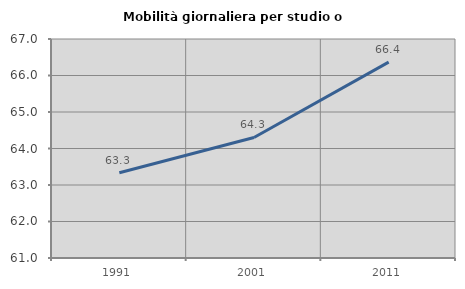
| Category | Mobilità giornaliera per studio o lavoro |
|---|---|
| 1991.0 | 63.336 |
| 2001.0 | 64.302 |
| 2011.0 | 66.366 |